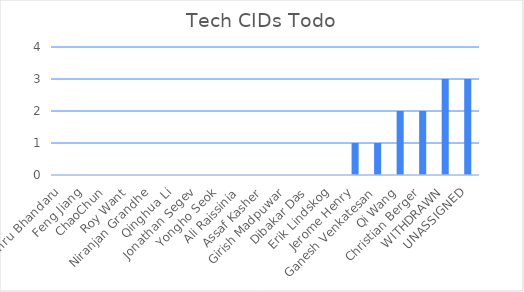
| Category | Series 0 |
|---|---|
| Nehru Bhandaru | 0 |
| Feng Jiang | 0 |
| ChaoChun | 0 |
| Roy Want | 0 |
| Niranjan Grandhe | 0 |
| Qinghua Li | 0 |
| Jonathan Segev | 0 |
| Yongho Seok | 0 |
| Ali Raissinia | 0 |
| Assaf Kasher | 0 |
| Girish Madpuwar | 0 |
| Dibakar Das | 0 |
| Erik Lindskog | 0 |
| Jerome Henry | 1 |
| Ganesh Venkatesan | 1 |
| Qi Wang | 2 |
| Christian Berger | 2 |
| WITHDRAWN | 3 |
| UNASSIGNED | 3 |